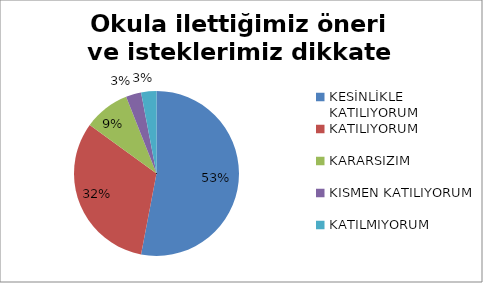
| Category | Okula ilettiğimiz öneri ve isteklerimiz dikkate alınır. |
|---|---|
| KESİNLİKLE KATILIYORUM | 106 |
| KATILIYORUM | 64 |
| KARARSIZIM | 18 |
| KISMEN KATILIYORUM | 6 |
| KATILMIYORUM | 6 |